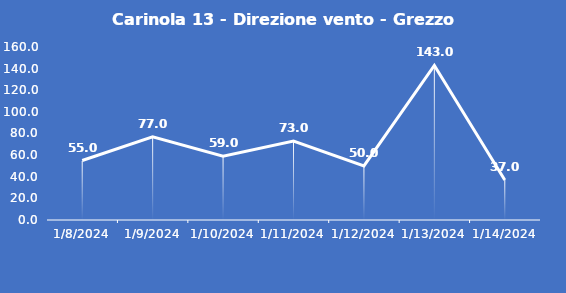
| Category | Carinola 13 - Direzione vento - Grezzo (°N) |
|---|---|
| 1/8/24 | 55 |
| 1/9/24 | 77 |
| 1/10/24 | 59 |
| 1/11/24 | 73 |
| 1/12/24 | 50 |
| 1/13/24 | 143 |
| 1/14/24 | 37 |